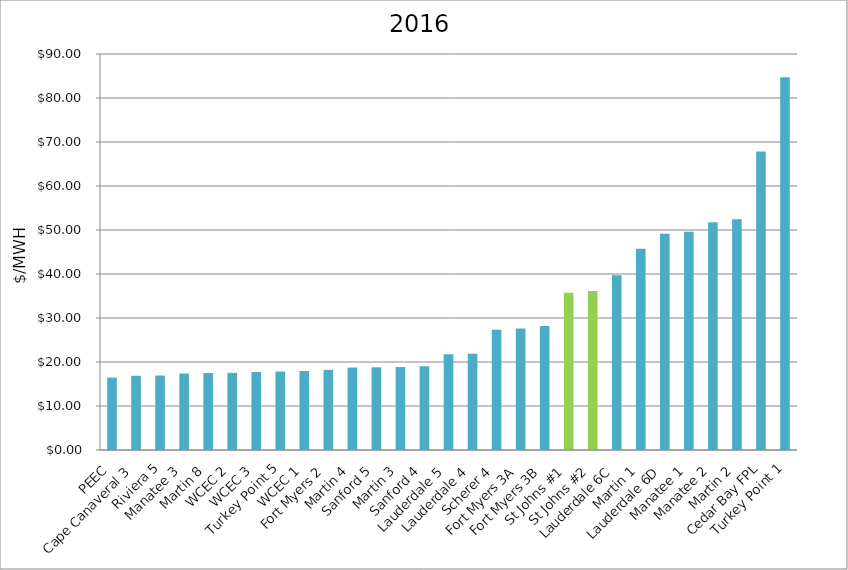
| Category | $/MW |
|---|---|
| PEEC | 16.449 |
| Cape Canaveral 3 | 16.87 |
| Riviera 5 | 16.933 |
| Manatee 3 | 17.384 |
| Martin 8 | 17.493 |
| WCEC 2 | 17.53 |
| WCEC 3 | 17.736 |
| Turkey Point 5 | 17.836 |
| WCEC 1 | 17.95 |
| Fort Myers 2 | 18.214 |
| Martin 4 | 18.743 |
| Sanford 5 | 18.791 |
| Martin 3 | 18.843 |
| Sanford 4 | 19.031 |
| Lauderdale 5 | 21.759 |
| Lauderdale 4 | 21.888 |
| Scherer 4 | 27.324 |
| Fort Myers 3A | 27.627 |
| Fort Myers 3B | 28.158 |
| St Johns #1 | 35.721 |
| St Johns #2 | 36.136 |
| Lauderdale 6C | 39.744 |
| Martin 1 | 45.736 |
| Lauderdale 6D | 49.168 |
| Manatee 1 | 49.619 |
| Manatee 2 | 51.749 |
| Martin 2 | 52.419 |
| Cedar Bay FPL | 67.837 |
| Turkey Point 1 | 84.711 |